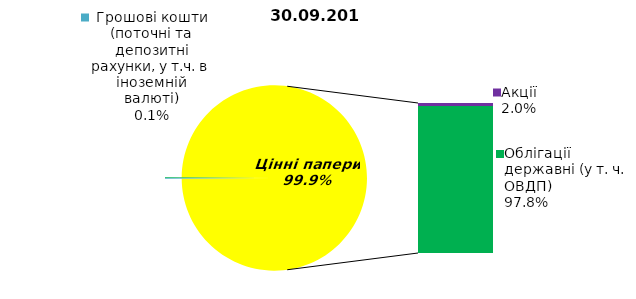
| Category | Series 0 |
|---|---|
| Грошові кошти (поточні та депозитні рахунки, у т.ч. в іноземній валюті) | 0.134 |
| Банківські метали | 0 |
| Нерухомість | 0 |
| Інші активи | -0.108 |
| Акції | 2.248 |
| Облігації підприємств | 0 |
| Муніципальні облігації | 0 |
| Облігації державні (у т. ч. ОВДП) | 110.311 |
| Іпотечні сертифікати | 0 |